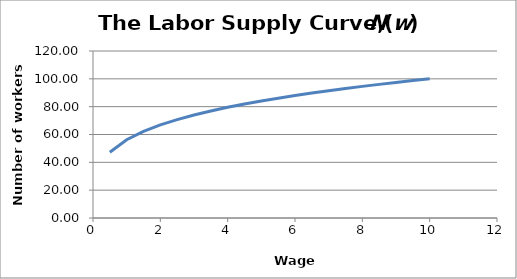
| Category | Series 0 |
|---|---|
| 0.5 | 47.287 |
| 1.0 | 56.234 |
| 1.5 | 62.233 |
| 2.0 | 66.874 |
| 2.5 | 70.711 |
| 3.0 | 74.008 |
| 3.5 | 76.916 |
| 4.0 | 79.527 |
| 4.5 | 81.904 |
| 5.0 | 84.09 |
| 5.5 | 86.117 |
| 6.0 | 88.011 |
| 6.5 | 89.79 |
| 7.0 | 91.469 |
| 7.5 | 93.06 |
| 8.0 | 94.574 |
| 8.5 | 96.018 |
| 9.0 | 97.4 |
| 9.5 | 98.726 |
| 10.0 | 100 |